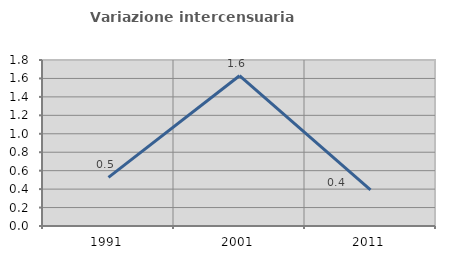
| Category | Variazione intercensuaria annua |
|---|---|
| 1991.0 | 0.527 |
| 2001.0 | 1.63 |
| 2011.0 | 0.391 |